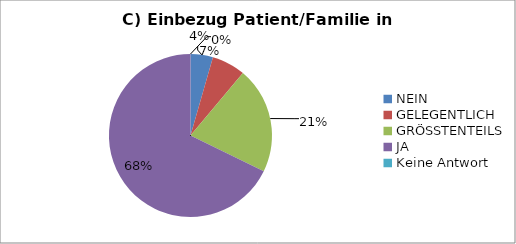
| Category | Series 0 |
|---|---|
| NEIN | 4 |
| GELEGENTLICH | 6 |
| GRÖSSTENTEILS | 19 |
| JA | 61 |
| Keine Antwort | 0 |